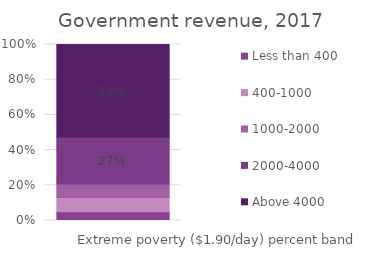
| Category | Less than 400 | 400-1000 | 1000-2000 | 2000-4000 | Above 4000 |
|---|---|---|---|---|---|
| 0 | 0.049 | 0.081 | 0.077 | 0.266 | 0.527 |